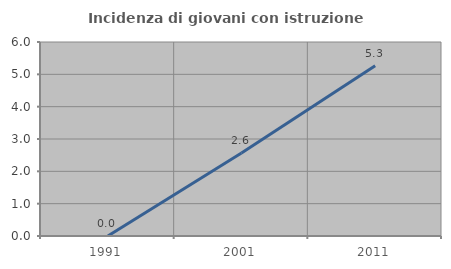
| Category | Incidenza di giovani con istruzione universitaria |
|---|---|
| 1991.0 | 0 |
| 2001.0 | 2.564 |
| 2011.0 | 5.263 |